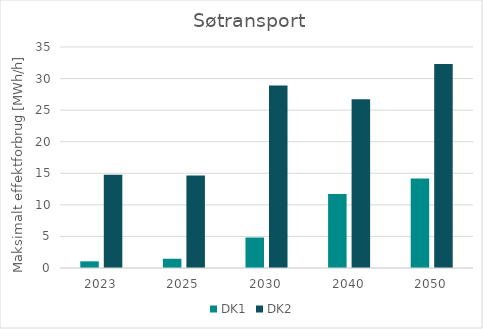
| Category | DK1 | DK2 |
|---|---|---|
| 2023.0 | 1.059 | 14.754 |
| 2025.0 | 1.465 | 14.657 |
| 2030.0 | 4.827 | 28.919 |
| 2040.0 | 11.713 | 26.732 |
| 2050.0 | 14.164 | 32.324 |